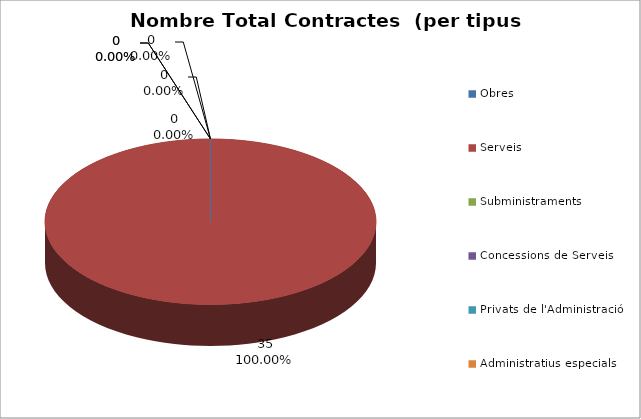
| Category | Nombre Total Contractes |
|---|---|
| Obres | 0 |
| Serveis | 35 |
| Subministraments | 0 |
| Concessions de Serveis | 0 |
| Privats de l'Administració | 0 |
| Administratius especials | 0 |